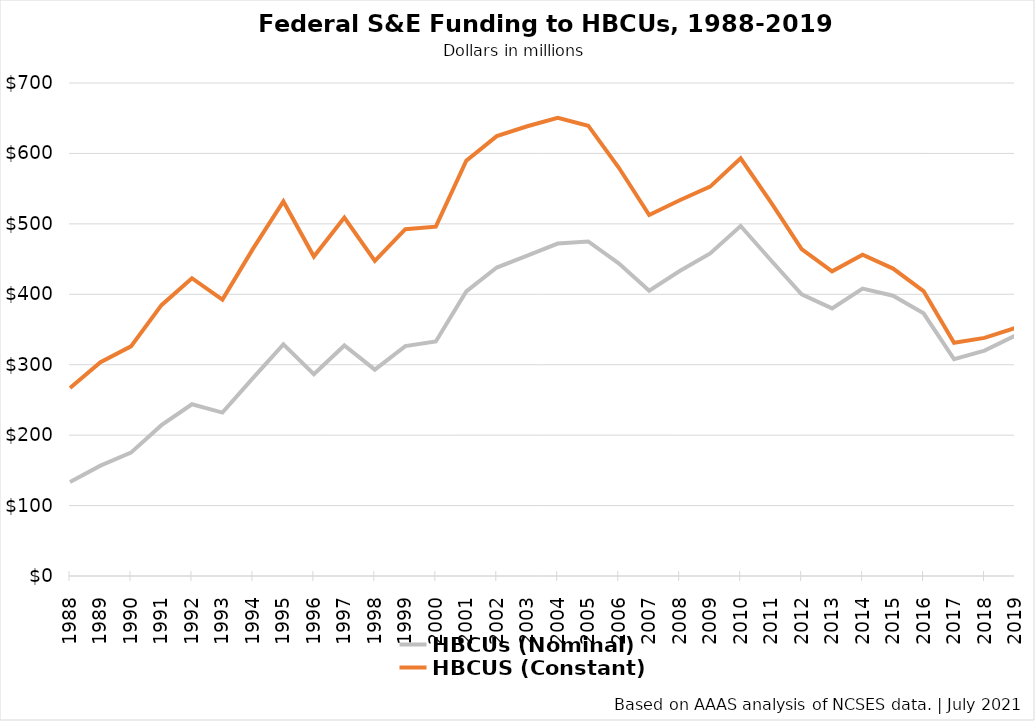
| Category | HBCUs (Nominal) | HBCUS (Constant) |
|---|---|---|
| 1988 | 133.47 | 266.87 |
| 1989 | 156.668 | 303.448 |
| 1990 | 175.187 | 326.112 |
| 1991 | 214.164 | 384.583 |
| 1992 | 243.872 | 422.858 |
| 1993 | 232.017 | 392.498 |
| 1994 | 281.016 | 464.484 |
| 1995 | 328.787 | 531.861 |
| 1996 | 286.388 | 453.607 |
| 1997 | 327.321 | 508.883 |
| 1998 | 292.991 | 447.565 |
| 1999 | 326.427 | 492.496 |
| 2000 | 333.019 | 496.065 |
| 2001 | 404 | 589.685 |
| 2002 | 438 | 624.578 |
| 2003 | 455 | 638.582 |
| 2004 | 472 | 650.571 |
| 2005 | 475 | 639.38 |
| 2006 | 444 | 579.961 |
| 2007 | 405 | 512.61 |
| 2008 | 433 | 533.518 |
| 2009 | 458 | 552.893 |
| 2010 | 497 | 593.118 |
| 2011 | 448 | 530.085 |
| 2012 | 400 | 464.031 |
| 2013 | 380 | 432.63 |
| 2014 | 408 | 456.115 |
| 2015 | 398 | 436.535 |
| 2016 | 373 | 404.593 |
| 2017 | 308 | 331.153 |
| 2018 | 320 | 338.053 |
| 2019 | 341 | 352.103 |